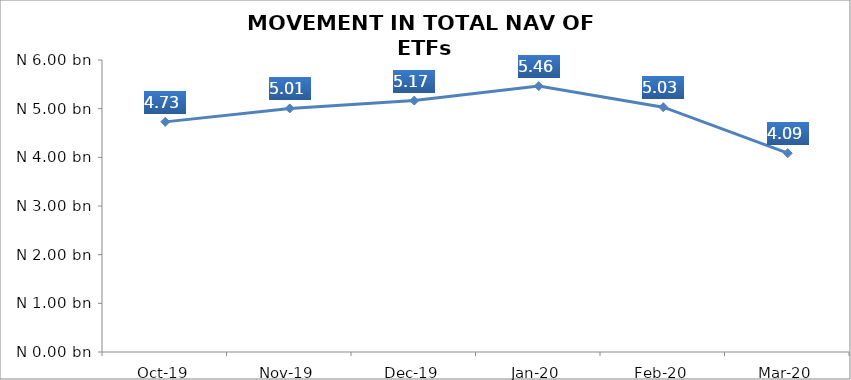
| Category | Series 0 |
|---|---|
| 2019-10-01 | 4728711300.68 |
| 2019-11-01 | 5005279567.02 |
| 2019-12-01 | 5165913992.06 |
| 2020-01-01 | 5464063863.02 |
| 2020-02-01 | 5030305629.7 |
| 2020-03-01 | 4085799334.74 |